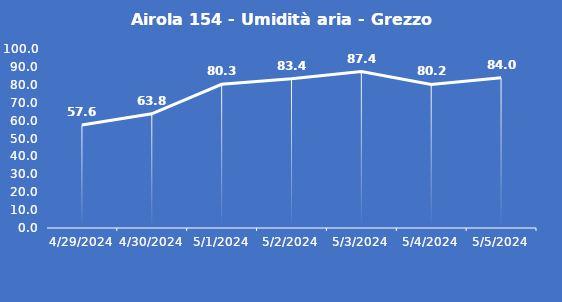
| Category | Airola 154 - Umidità aria - Grezzo (%) |
|---|---|
| 4/29/24 | 57.6 |
| 4/30/24 | 63.8 |
| 5/1/24 | 80.3 |
| 5/2/24 | 83.4 |
| 5/3/24 | 87.4 |
| 5/4/24 | 80.2 |
| 5/5/24 | 84 |